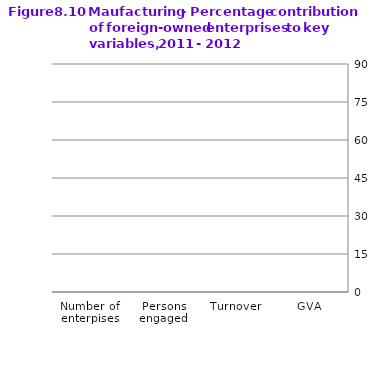
| Category | 2011 | 2012 |
|---|---|---|
| Number of enterpises | 0 | 0 |
| Persons engaged | 0 | 0 |
| Turnover | 0 | 0 |
| GVA | 0 | 0 |